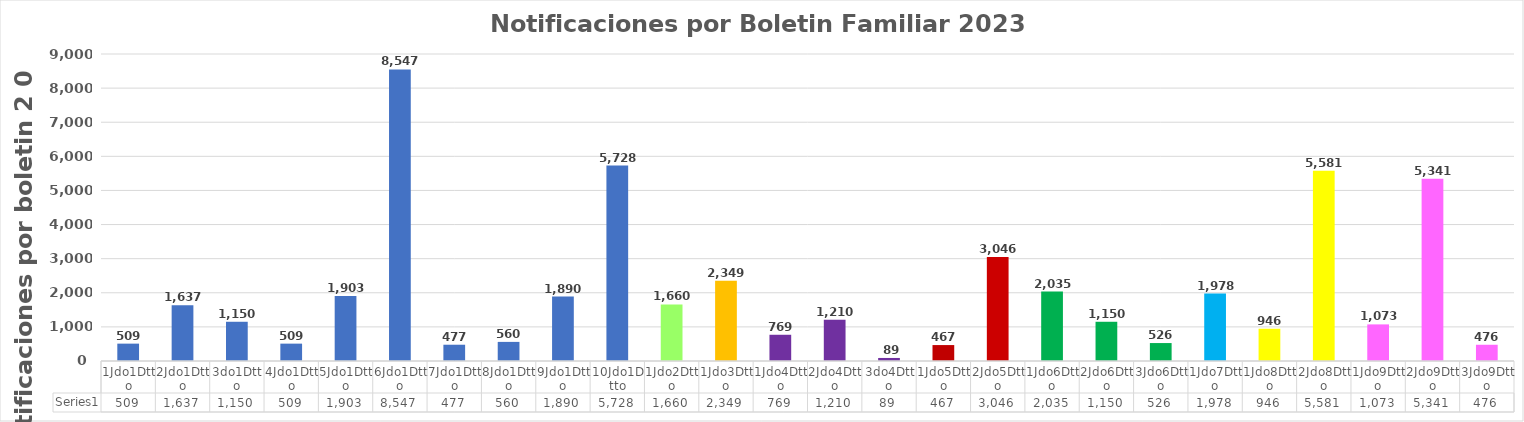
| Category | Series 0 |
|---|---|
| 1Jdo1Dtto | 509 |
| 2Jdo1Dtto | 1637 |
| 3do1Dtto | 1150 |
| 4Jdo1Dtto | 509 |
| 5Jdo1Dtto | 1903 |
| 6Jdo1Dtto | 8547 |
| 7Jdo1Dtto | 477 |
| 8Jdo1Dtto | 560 |
| 9Jdo1Dtto | 1890 |
| 10Jdo1Dtto | 5728 |
| 1Jdo2Dtto | 1660 |
| 1Jdo3Dtto | 2349 |
| 1Jdo4Dtto | 769 |
| 2Jdo4Dtto | 1210 |
| 3do4Dtto | 89 |
| 1Jdo5Dtto | 467 |
| 2Jdo5Dtto | 3046 |
| 1Jdo6Dtto | 2035 |
| 2Jdo6Dtto | 1150 |
| 3Jdo6Dtto | 526 |
| 1Jdo7Dtto | 1978 |
| 1Jdo8Dtto | 946 |
| 2Jdo8Dtto | 5581 |
| 1Jdo9Dtto | 1073 |
| 2Jdo9Dtto | 5341 |
| 3Jdo9Dtto | 476 |